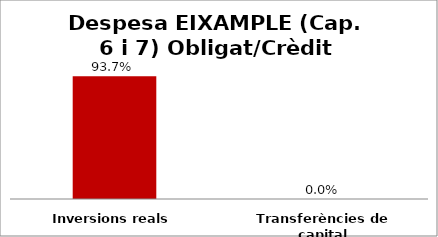
| Category | Series 0 |
|---|---|
| Inversions reals | 0.937 |
| Transferències de capital | 0 |